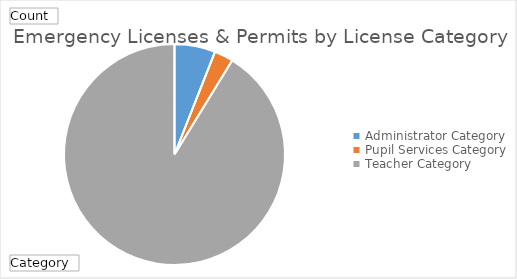
| Category | Total |
|---|---|
| Administrator Category | 129 |
| Pupil Services Category | 60 |
| Teacher Category | 1969 |